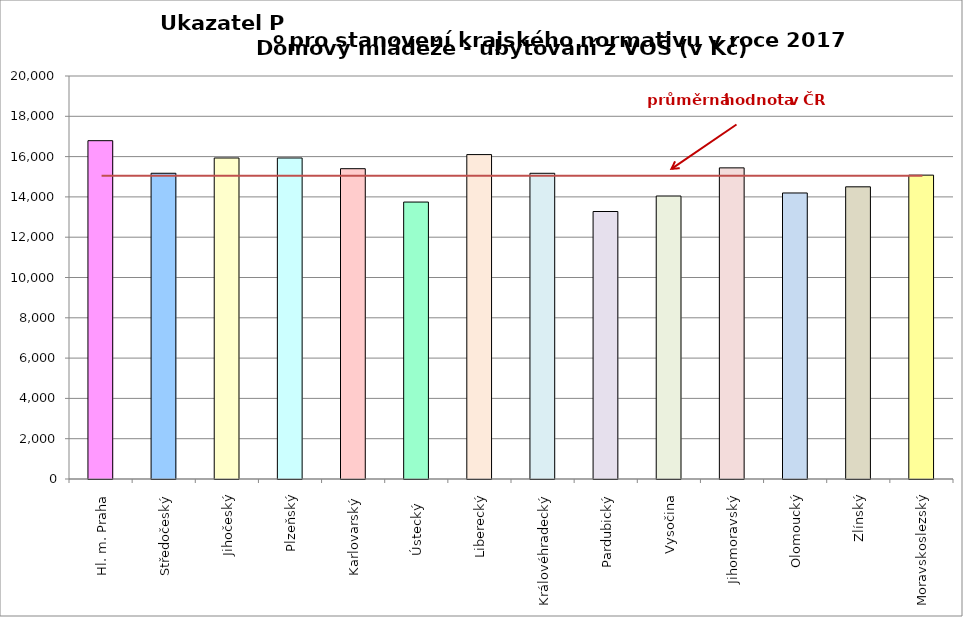
| Category | Series 0 |
|---|---|
| Hl. m. Praha | 16790 |
| Středočeský | 15173 |
| Jihočeský | 15931 |
| Plzeňský | 15931 |
| Karlovarský  | 15400 |
| Ústecký   | 13744 |
| Liberecký | 16100 |
| Královéhradecký | 15172 |
| Pardubický | 13275 |
| Vysočina | 14044 |
| Jihomoravský | 15441 |
| Olomoucký | 14195 |
| Zlínský | 14500 |
| Moravskoslezský | 15080 |